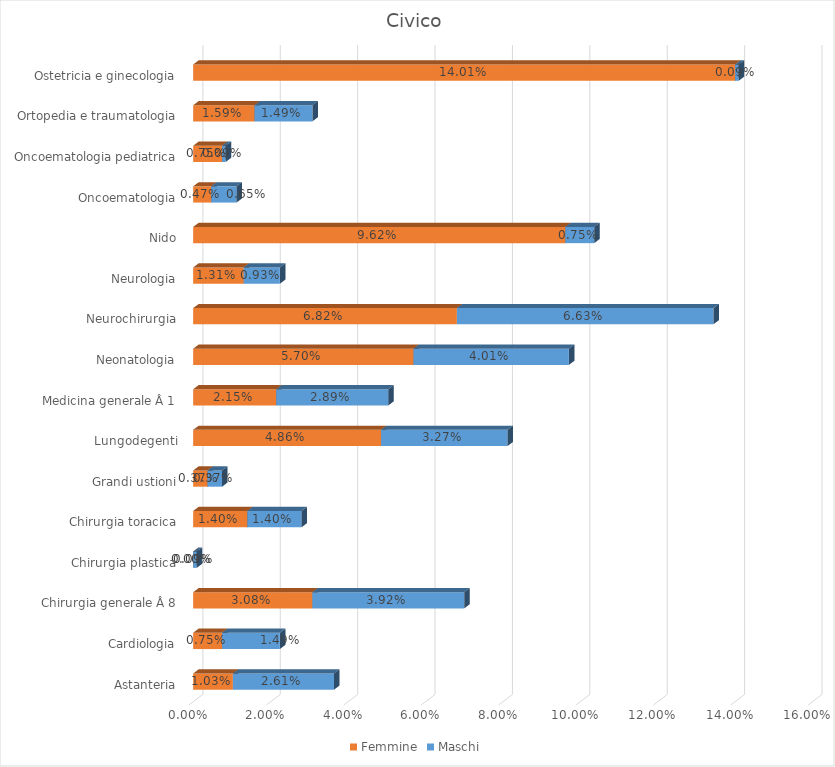
| Category | Femmine | Maschi |
|---|---|---|
| Astanteria | 0.01 | 0.026 |
| Cardiologia | 0.007 | 0.015 |
| Chirurgia generale Â 8 | 0.031 | 0.039 |
| Chirurgia plastica | 0 | 0.001 |
| Chirurgia toracica | 0.014 | 0.014 |
| Grandi ustioni | 0.004 | 0.004 |
| Lungodegenti | 0.049 | 0.033 |
| Medicina generale Â 1 | 0.021 | 0.029 |
| Neonatologia | 0.057 | 0.04 |
| Neurochirurgia | 0.068 | 0.066 |
| Neurologia | 0.013 | 0.009 |
| Nido | 0.096 | 0.007 |
| Oncoematologia | 0.005 | 0.007 |
| Oncoematologia pediatrica | 0.007 | 0.001 |
| Ortopedia e traumatologia | 0.016 | 0.015 |
| Ostetricia e ginecologia | 0.14 | 0.001 |